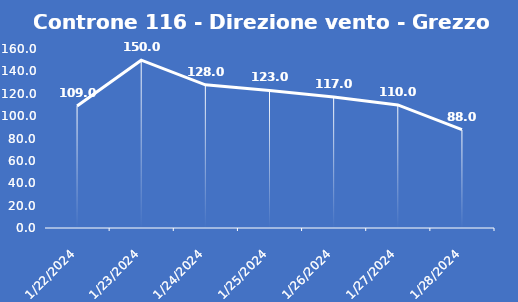
| Category | Controne 116 - Direzione vento - Grezzo (°N) |
|---|---|
| 1/22/24 | 109 |
| 1/23/24 | 150 |
| 1/24/24 | 128 |
| 1/25/24 | 123 |
| 1/26/24 | 117 |
| 1/27/24 | 110 |
| 1/28/24 | 88 |